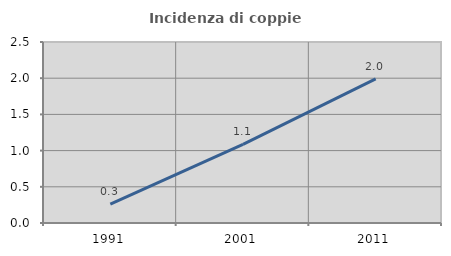
| Category | Incidenza di coppie miste |
|---|---|
| 1991.0 | 0.262 |
| 2001.0 | 1.086 |
| 2011.0 | 1.99 |